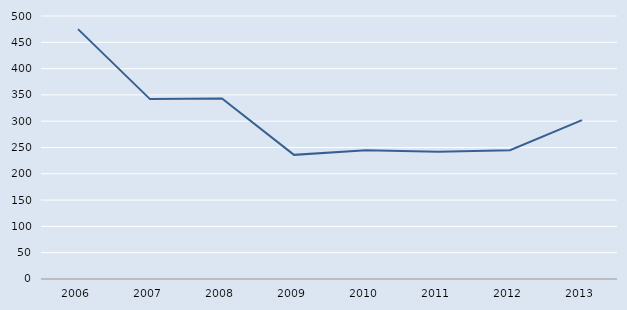
| Category | Series 0 |
|---|---|
| 2006.0 | 475 |
| 2007.0 | 342 |
| 2008.0 | 343 |
| 2009.0 | 236 |
| 2010.0 | 245 |
| 2011.0 | 242 |
| 2012.0 | 245 |
| 2013.0 | 302 |